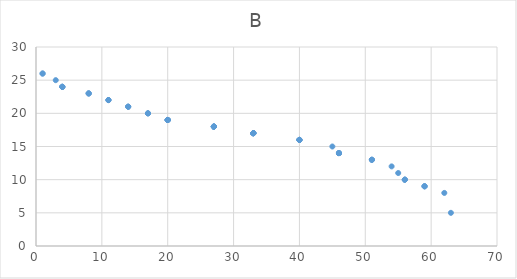
| Category | Series 0 |
|---|---|
| 1.0 | 26 |
| 3.0 | 25 |
| 8.0 | 23 |
| 4.0 | 24 |
| 14.0 | 21 |
| 1.0 | 26 |
| 4.0 | 24 |
| 4.0 | 24 |
| 17.0 | 20 |
| 8.0 | 23 |
| 11.0 | 22 |
| 4.0 | 24 |
| 14.0 | 21 |
| 27.0 | 18 |
| 14.0 | 21 |
| 20.0 | 19 |
| 27.0 | 18 |
| 20.0 | 19 |
| 11.0 | 22 |
| 11.0 | 22 |
| 20.0 | 19 |
| 27.0 | 18 |
| 33.0 | 17 |
| 20.0 | 19 |
| 27.0 | 18 |
| 33.0 | 17 |
| 33.0 | 17 |
| 33.0 | 17 |
| 46.0 | 14 |
| 17.0 | 20 |
| 20.0 | 19 |
| 20.0 | 19 |
| 20.0 | 19 |
| 8.0 | 23 |
| 27.0 | 18 |
| 33.0 | 17 |
| 17.0 | 20 |
| 51.0 | 13 |
| 27.0 | 18 |
| 33.0 | 17 |
| 40.0 | 16 |
| 40.0 | 16 |
| 46.0 | 14 |
| 46.0 | 14 |
| 40.0 | 16 |
| 40.0 | 16 |
| 59.0 | 9 |
| 59.0 | 9 |
| 45.0 | 15 |
| 40.0 | 16 |
| 54.0 | 12 |
| 56.0 | 10 |
| 56.0 | 10 |
| 33.0 | 17 |
| 59.0 | 9 |
| 55.0 | 11 |
| 51.0 | 13 |
| 62.0 | 8 |
| 51.0 | 13 |
| 56.0 | 10 |
| 46.0 | 14 |
| 46.0 | 14 |
| 63.0 | 5 |